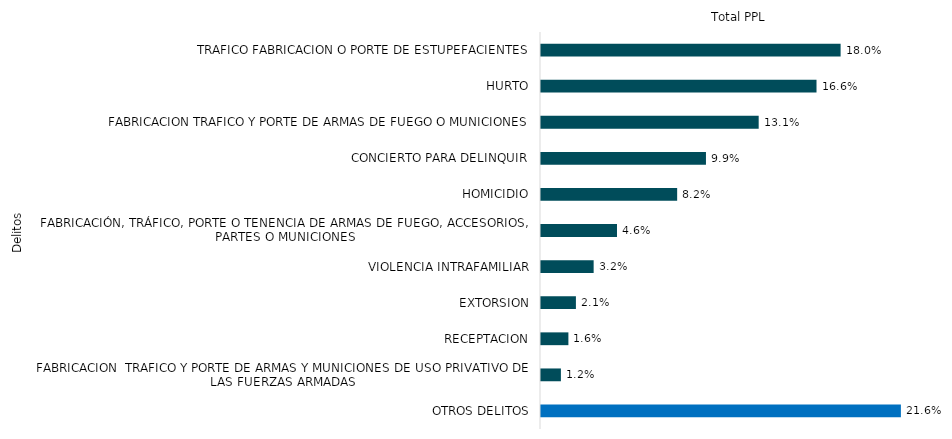
| Category | Series 0 |
|---|---|
| TRAFICO FABRICACION O PORTE DE ESTUPEFACIENTES | 14906 |
| HURTO | 13707 |
| FABRICACION TRAFICO Y PORTE DE ARMAS DE FUEGO O MUNICIONES | 10830 |
| CONCIERTO PARA DELINQUIR | 8207 |
| HOMICIDIO | 6774 |
| FABRICACIÓN, TRÁFICO, PORTE O TENENCIA DE ARMAS DE FUEGO, ACCESORIOS, PARTES O MUNICIONES | 3781 |
| VIOLENCIA INTRAFAMILIAR | 2619 |
| EXTORSION | 1737 |
| RECEPTACION | 1363 |
| FABRICACION  TRAFICO Y PORTE DE ARMAS Y MUNICIONES DE USO PRIVATIVO DE LAS FUERZAS ARMADAS | 990 |
| OTROS DELITOS | 17905 |